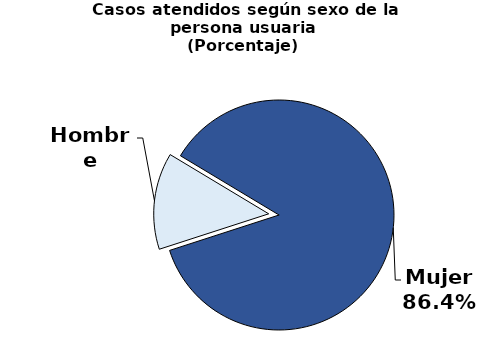
| Category | Series 0 |
|---|---|
| Mujer | 16444 |
| Hombre | 2587 |